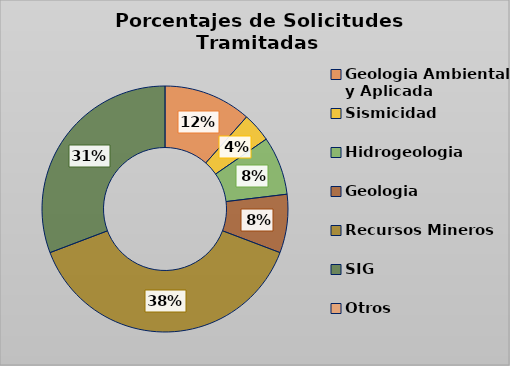
| Category | Series 0 |
|---|---|
| Geologia Ambiental y Aplicada | 11.538 |
| Sismicidad | 3.846 |
| Hidrogeologia | 7.692 |
| Geologia | 7.692 |
| Recursos Mineros | 38.462 |
| SIG | 30.769 |
| Otros | 0 |